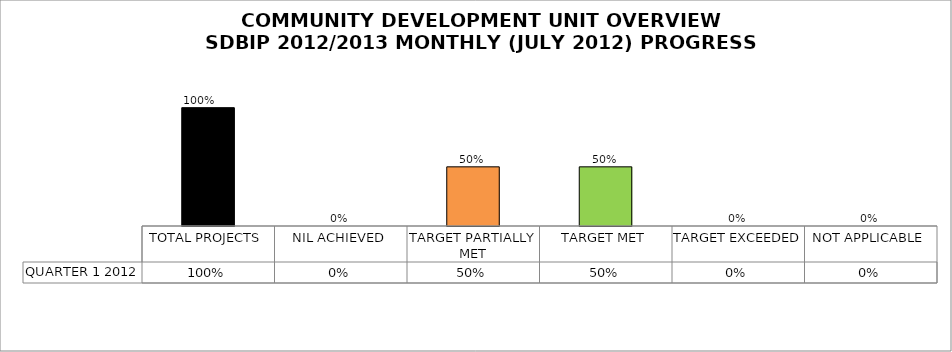
| Category | QUARTER 1 2012 |
|---|---|
| TOTAL PROJECTS | 1 |
| NIL ACHIEVED | 0 |
| TARGET PARTIALLY MET | 0.5 |
| TARGET MET | 0.5 |
| TARGET EXCEEDED | 0 |
| NOT APPLICABLE | 0 |